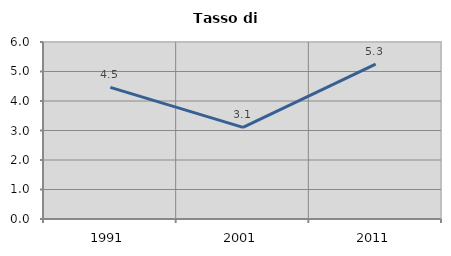
| Category | Tasso di disoccupazione   |
|---|---|
| 1991.0 | 4.463 |
| 2001.0 | 3.105 |
| 2011.0 | 5.253 |